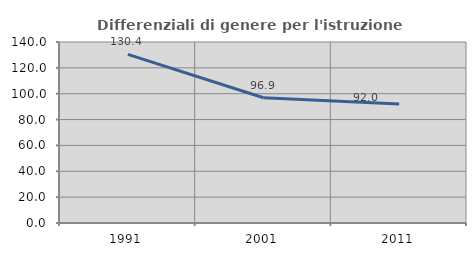
| Category | Differenziali di genere per l'istruzione superiore |
|---|---|
| 1991.0 | 130.443 |
| 2001.0 | 96.896 |
| 2011.0 | 92.03 |